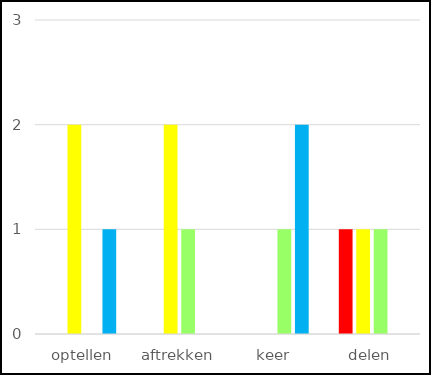
| Category | Series 0 | Series 1 | Series 2 | Series 3 |
|---|---|---|---|---|
| optellen | 0 | 2 | 0 | 1 |
| aftrekken | 0 | 2 | 1 | 0 |
| keer | 0 | 0 | 1 | 2 |
| delen | 1 | 1 | 1 | 0 |